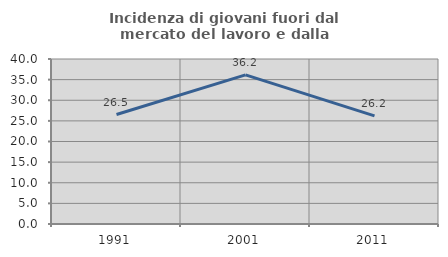
| Category | Incidenza di giovani fuori dal mercato del lavoro e dalla formazione  |
|---|---|
| 1991.0 | 26.534 |
| 2001.0 | 36.159 |
| 2011.0 | 26.207 |